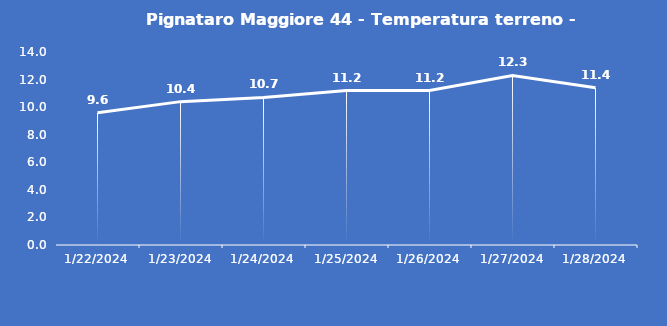
| Category | Pignataro Maggiore 44 - Temperatura terreno - Grezzo (°C) |
|---|---|
| 1/22/24 | 9.6 |
| 1/23/24 | 10.4 |
| 1/24/24 | 10.7 |
| 1/25/24 | 11.2 |
| 1/26/24 | 11.2 |
| 1/27/24 | 12.3 |
| 1/28/24 | 11.4 |